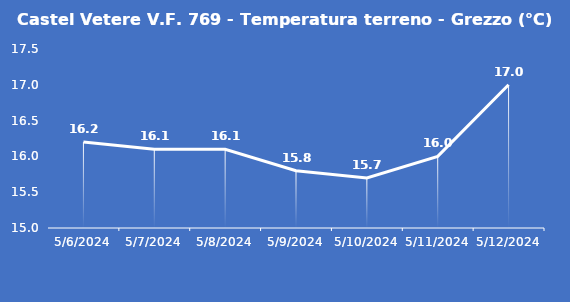
| Category | Castel Vetere V.F. 769 - Temperatura terreno - Grezzo (°C) |
|---|---|
| 5/6/24 | 16.2 |
| 5/7/24 | 16.1 |
| 5/8/24 | 16.1 |
| 5/9/24 | 15.8 |
| 5/10/24 | 15.7 |
| 5/11/24 | 16 |
| 5/12/24 | 17 |